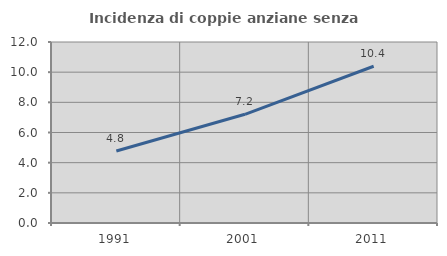
| Category | Incidenza di coppie anziane senza figli  |
|---|---|
| 1991.0 | 4.774 |
| 2001.0 | 7.208 |
| 2011.0 | 10.391 |